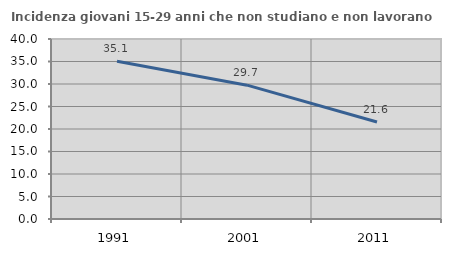
| Category | Incidenza giovani 15-29 anni che non studiano e non lavorano  |
|---|---|
| 1991.0 | 35.052 |
| 2001.0 | 29.744 |
| 2011.0 | 21.569 |